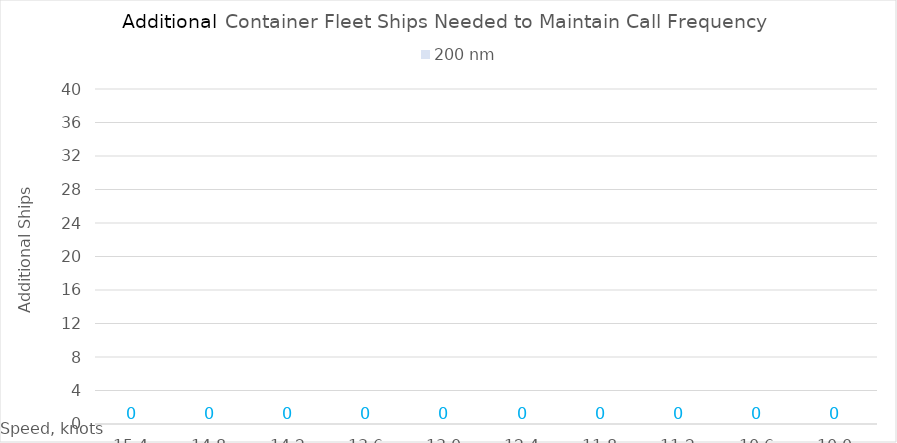
| Category | 200 |
|---|---|
| 15.4 | 0 |
| 14.8 | 0 |
| 14.200000000000001 | 0 |
| 13.600000000000001 | 0 |
| 13.000000000000002 | 0 |
| 12.400000000000002 | 0 |
| 11.800000000000002 | 0 |
| 11.200000000000003 | 0 |
| 10.600000000000003 | 0 |
| 10.000000000000004 | 0 |